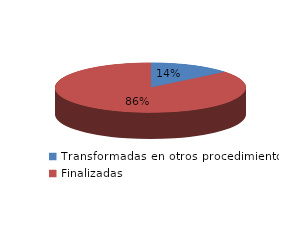
| Category | Series 0 |
|---|---|
| Transformadas en otros procedimientos | 3617 |
| Finalizadas | 22149 |